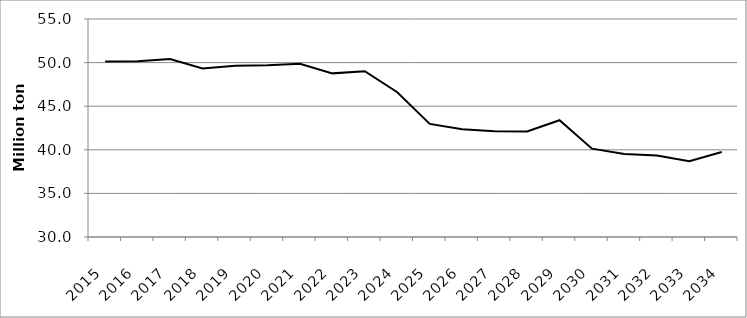
| Category | C05a-3Q |
|---|---|
| 2015.0 | 50.117 |
| 2016.0 | 50.159 |
| 2017.0 | 50.402 |
| 2018.0 | 49.33 |
| 2019.0 | 49.651 |
| 2020.0 | 49.683 |
| 2021.0 | 49.859 |
| 2022.0 | 48.765 |
| 2023.0 | 49.008 |
| 2024.0 | 46.602 |
| 2025.0 | 42.967 |
| 2026.0 | 42.35 |
| 2027.0 | 42.121 |
| 2028.0 | 42.107 |
| 2029.0 | 43.39 |
| 2030.0 | 40.13 |
| 2031.0 | 39.521 |
| 2032.0 | 39.346 |
| 2033.0 | 38.679 |
| 2034.0 | 39.75 |